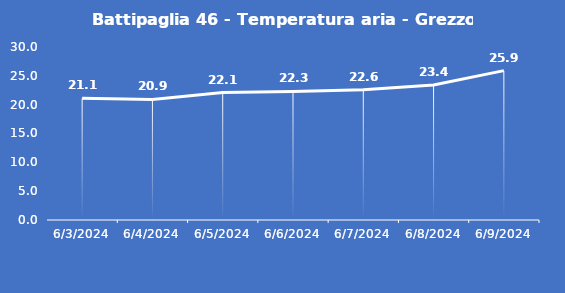
| Category | Battipaglia 46 - Temperatura aria - Grezzo (°C) |
|---|---|
| 6/3/24 | 21.1 |
| 6/4/24 | 20.9 |
| 6/5/24 | 22.1 |
| 6/6/24 | 22.3 |
| 6/7/24 | 22.6 |
| 6/8/24 | 23.4 |
| 6/9/24 | 25.9 |